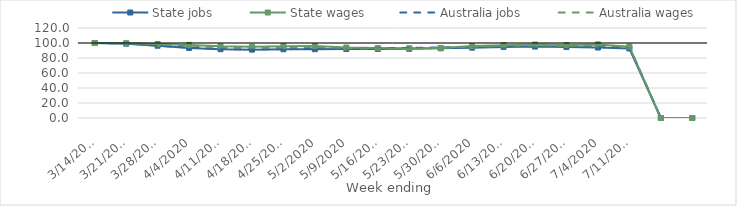
| Category | State jobs | State wages | Australia jobs | Australia wages |
|---|---|---|---|---|
| 14/03/2020 | 100 | 100 | 100 | 100 |
| 21/03/2020 | 99.106 | 99.68 | 99.345 | 99.743 |
| 28/03/2020 | 96.354 | 98.643 | 96.491 | 98.481 |
| 04/04/2020 | 93.387 | 97.485 | 93.819 | 96.778 |
| 11/04/2020 | 91.71 | 95.527 | 91.996 | 94.184 |
| 18/04/2020 | 91.164 | 94.999 | 91.451 | 94.032 |
| 25/04/2020 | 91.654 | 95.799 | 91.738 | 94.241 |
| 02/05/2020 | 91.751 | 95.962 | 92.109 | 94.689 |
| 09/05/2020 | 91.897 | 94.014 | 92.629 | 93.316 |
| 16/05/2020 | 92.07 | 93.267 | 93.158 | 92.67 |
| 23/05/2020 | 92.216 | 92.944 | 93.449 | 92.26 |
| 30/05/2020 | 92.924 | 93.282 | 94.006 | 93.552 |
| 06/06/2020 | 93.795 | 95.974 | 94.942 | 95.15 |
| 13/06/2020 | 94.774 | 96.946 | 95.443 | 95.811 |
| 20/06/2020 | 95.232 | 97.974 | 95.785 | 96.851 |
| 27/06/2020 | 94.577 | 97.19 | 95.571 | 95.974 |
| 04/07/2020 | 93.952 | 98.152 | 95.033 | 96.971 |
| 11/07/2020 | 92.679 | 95.22 | 94.423 | 95.167 |